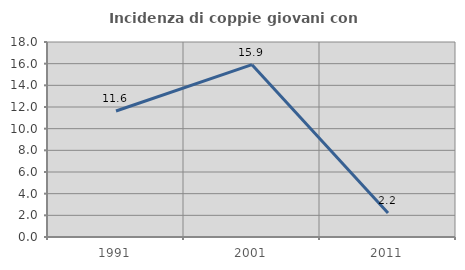
| Category | Incidenza di coppie giovani con figli |
|---|---|
| 1991.0 | 11.628 |
| 2001.0 | 15.909 |
| 2011.0 | 2.222 |